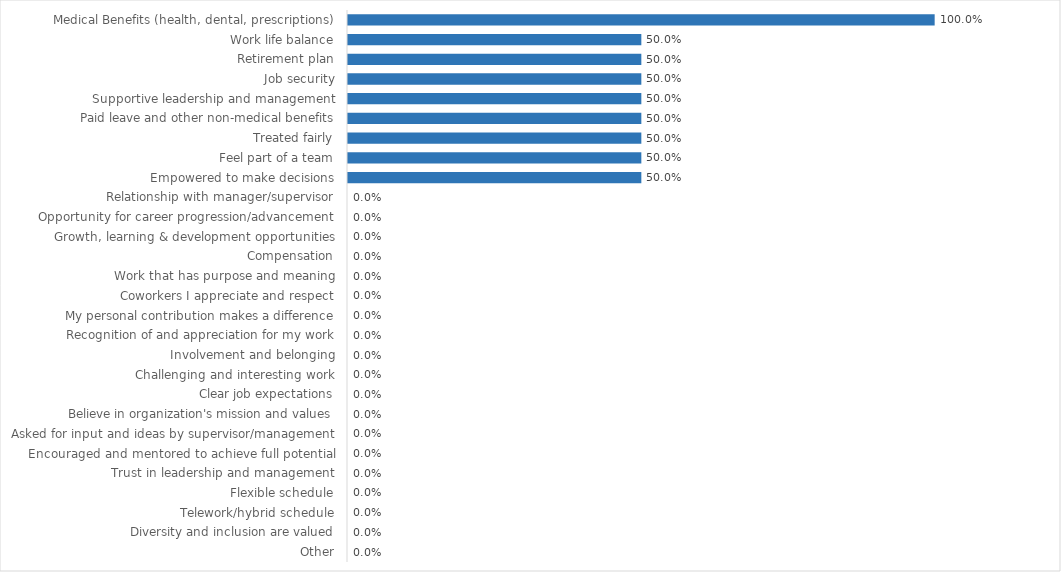
| Category | Labor Relations Board |
|---|---|
| Medical Benefits (health, dental, prescriptions) | 1 |
| Work life balance | 0.5 |
| Retirement plan | 0.5 |
| Job security | 0.5 |
| Supportive leadership and management | 0.5 |
| Paid leave and other non-medical benefits | 0.5 |
| Treated fairly | 0.5 |
| Feel part of a team | 0.5 |
| Empowered to make decisions | 0.5 |
| Relationship with manager/supervisor | 0 |
| Opportunity for career progression/advancement | 0 |
| Growth, learning & development opportunities | 0 |
| Compensation | 0 |
| Work that has purpose and meaning | 0 |
| Coworkers I appreciate and respect | 0 |
| My personal contribution makes a difference | 0 |
| Recognition of and appreciation for my work | 0 |
| Involvement and belonging | 0 |
| Challenging and interesting work | 0 |
| Clear job expectations | 0 |
| Believe in organization's mission and values | 0 |
| Asked for input and ideas by supervisor/management | 0 |
| Encouraged and mentored to achieve full potential | 0 |
| Trust in leadership and management | 0 |
| Flexible schedule | 0 |
| Telework/hybrid schedule | 0 |
| Diversity and inclusion are valued | 0 |
| Other | 0 |